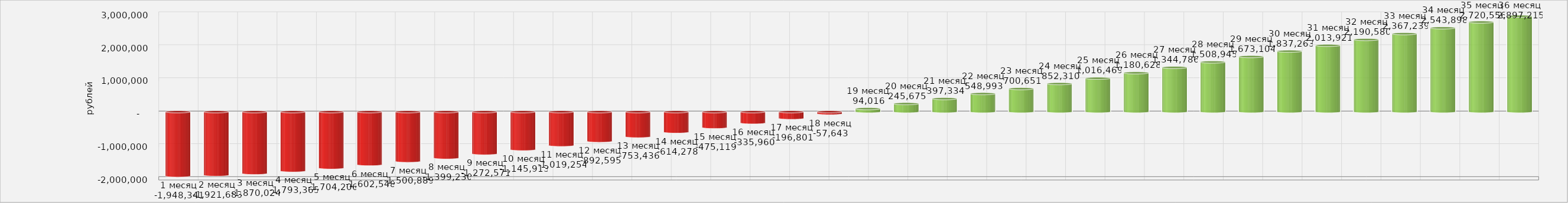
| Category | Series 1 |
|---|---|
| 1 месяц | -1948341.25 |
| 2 месяц | -1921682.5 |
| 3 месяц | -1870023.75 |
| 4 месяц | -1793365 |
| 5 месяц | -1704206.25 |
| 6 месяц | -1602547.5 |
| 7 месяц | -1500888.75 |
| 8 месяц | -1399230 |
| 9 месяц | -1272571.25 |
| 10 месяц | -1145912.5 |
| 11 месяц | -1019253.75 |
| 12 месяц | -892595 |
| 13 месяц | -753436.25 |
| 14 месяц | -614277.5 |
| 15 месяц | -475118.75 |
| 16 месяц | -335960 |
| 17 месяц | -196801.25 |
| 18 месяц | -57642.5 |
| 19 месяц | 94016.25 |
| 20 месяц | 245675 |
| 21 месяц | 397333.75 |
| 22 месяц | 548992.5 |
| 23 месяц | 700651.25 |
| 24 месяц | 852310 |
| 25 месяц | 1016468.75 |
| 26 месяц | 1180627.5 |
| 27 месяц | 1344786.25 |
| 28 месяц | 1508945 |
| 29 месяц | 1673103.75 |
| 30 месяц | 1837262.5 |
| 31 месяц | 2013921.25 |
| 32 месяц | 2190580 |
| 33 месяц | 2367238.75 |
| 34 месяц | 2543897.5 |
| 35 месяц | 2720556.25 |
| 36 месяц | 2897215 |